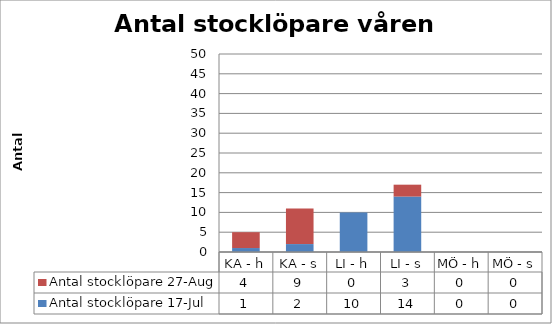
| Category | Antal stocklöpare |
|---|---|
| KA - h | 4 |
| KA - s | 9 |
| LI - h | 0 |
| LI - s | 3 |
| MÖ - h | 0 |
| MÖ - s | 0 |